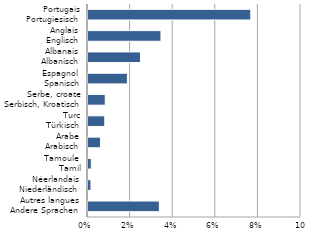
| Category | Series 0 |
|---|---|
|    Autres langues
Andere Sprachen | 0.033 |
|     Néerlandais
Niederländisch | 0.001 |
| Tamoule
     Tamil | 0.002 |
|    Arabe
Arabisch | 0.006 |
|      Turc
Türkisch | 0.008 |
|        Serbe, croate
Serbisch, Kroatisch | 0.008 |
| Espagnol
 Spanisch | 0.018 |
|  Albanais
Albanisch | 0.025 |
|  Anglais
Englisch | 0.034 |
|      Portugais
Portugiesisch | 0.076 |